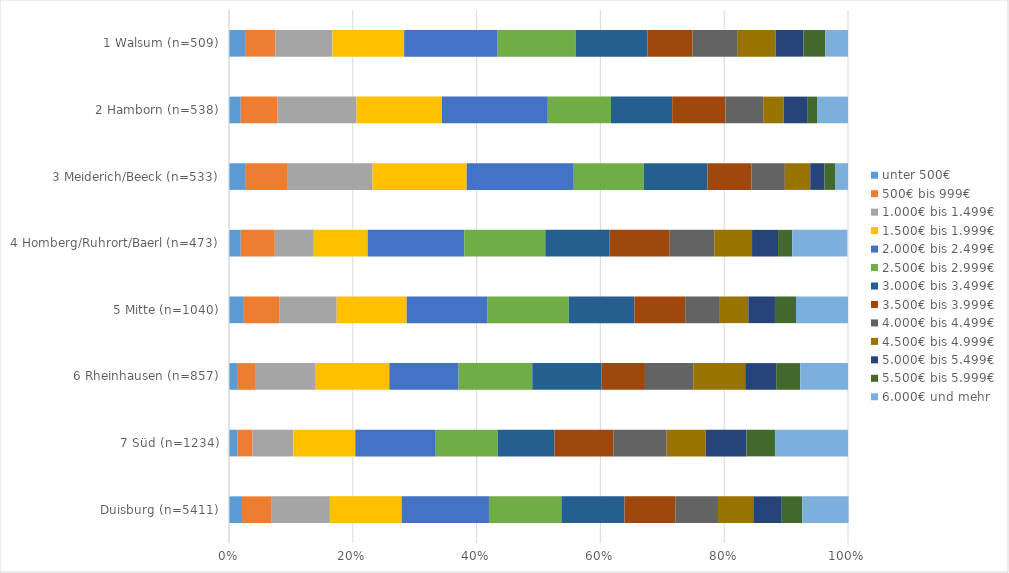
| Category | unter 500€ | 500€ bis 999€ | 1.000€ bis 1.499€ | 1.500€ bis 1.999€ | 2.000€ bis 2.499€ | 2.500€ bis 2.999€ | 3.000€ bis 3.499€ | 3.500€ bis 3.999€ | 4.000€ bis 4.499€ | 4.500€ bis 4.999€ | 5.000€ bis 5.499€ | 5.500€ bis 5.999€ | 6.000€ und mehr |
|---|---|---|---|---|---|---|---|---|---|---|---|---|---|
| Duisburg (n=5411) | 0.021 | 0.047 | 0.095 | 0.116 | 0.141 | 0.117 | 0.102 | 0.082 | 0.069 | 0.057 | 0.046 | 0.033 | 0.075 |
| 7 Süd (n=1234) | 0.014 | 0.024 | 0.066 | 0.1 | 0.13 | 0.1 | 0.092 | 0.095 | 0.086 | 0.063 | 0.066 | 0.046 | 0.118 |
| 6 Rheinhausen (n=857) | 0.013 | 0.029 | 0.097 | 0.12 | 0.112 | 0.119 | 0.112 | 0.07 | 0.078 | 0.084 | 0.05 | 0.039 | 0.077 |
| 5 Mitte (n=1040) | 0.024 | 0.057 | 0.093 | 0.113 | 0.13 | 0.132 | 0.106 | 0.082 | 0.056 | 0.046 | 0.043 | 0.034 | 0.086 |
| 4 Homberg/Ruhrort/Baerl (n=473) | 0.019 | 0.055 | 0.063 | 0.087 | 0.156 | 0.131 | 0.104 | 0.097 | 0.072 | 0.061 | 0.042 | 0.023 | 0.089 |
| 3 Meiderich/Beeck (n=533) | 0.026 | 0.069 | 0.137 | 0.152 | 0.173 | 0.113 | 0.103 | 0.071 | 0.054 | 0.041 | 0.023 | 0.017 | 0.021 |
| 2 Hamborn (n=538) | 0.019 | 0.059 | 0.128 | 0.138 | 0.171 | 0.102 | 0.099 | 0.086 | 0.061 | 0.033 | 0.039 | 0.015 | 0.05 |
| 1 Walsum (n=509) | 0.026 | 0.049 | 0.092 | 0.116 | 0.151 | 0.126 | 0.116 | 0.073 | 0.073 | 0.061 | 0.045 | 0.035 | 0.037 |